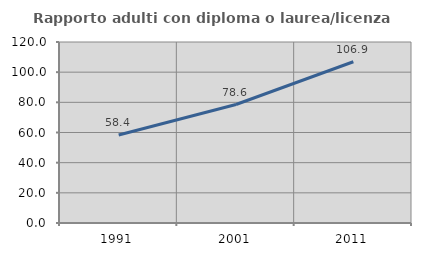
| Category | Rapporto adulti con diploma o laurea/licenza media  |
|---|---|
| 1991.0 | 58.36 |
| 2001.0 | 78.554 |
| 2011.0 | 106.889 |